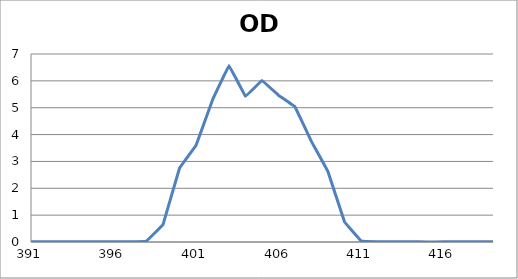
| Category | Series 0 |
|---|---|
| 2600.0 | 0.089 |
| 2599.0 | 0.09 |
| 2598.0 | 0.091 |
| 2597.0 | 0.091 |
| 2596.0 | 0.092 |
| 2595.0 | 0.093 |
| 2594.0 | 0.094 |
| 2593.0 | 0.095 |
| 2592.0 | 0.096 |
| 2591.0 | 0.096 |
| 2590.0 | 0.097 |
| 2589.0 | 0.098 |
| 2588.0 | 0.098 |
| 2587.0 | 0.099 |
| 2586.0 | 0.099 |
| 2585.0 | 0.1 |
| 2584.0 | 0.1 |
| 2583.0 | 0.1 |
| 2582.0 | 0.1 |
| 2581.0 | 0.1 |
| 2580.0 | 0.1 |
| 2579.0 | 0.1 |
| 2578.0 | 0.1 |
| 2577.0 | 0.1 |
| 2576.0 | 0.1 |
| 2575.0 | 0.099 |
| 2574.0 | 0.099 |
| 2573.0 | 0.099 |
| 2572.0 | 0.098 |
| 2571.0 | 0.098 |
| 2570.0 | 0.097 |
| 2569.0 | 0.096 |
| 2568.0 | 0.095 |
| 2567.0 | 0.095 |
| 2566.0 | 0.094 |
| 2565.0 | 0.093 |
| 2564.0 | 0.093 |
| 2563.0 | 0.092 |
| 2562.0 | 0.091 |
| 2561.0 | 0.09 |
| 2560.0 | 0.09 |
| 2559.0 | 0.089 |
| 2558.0 | 0.089 |
| 2557.0 | 0.088 |
| 2556.0 | 0.088 |
| 2555.0 | 0.087 |
| 2554.0 | 0.087 |
| 2553.0 | 0.087 |
| 2552.0 | 0.086 |
| 2551.0 | 0.086 |
| 2550.0 | 0.086 |
| 2549.0 | 0.085 |
| 2548.0 | 0.086 |
| 2547.0 | 0.086 |
| 2546.0 | 0.086 |
| 2545.0 | 0.086 |
| 2544.0 | 0.086 |
| 2543.0 | 0.087 |
| 2542.0 | 0.087 |
| 2541.0 | 0.088 |
| 2540.0 | 0.089 |
| 2539.0 | 0.089 |
| 2538.0 | 0.09 |
| 2537.0 | 0.09 |
| 2536.0 | 0.091 |
| 2535.0 | 0.092 |
| 2534.0 | 0.093 |
| 2533.0 | 0.094 |
| 2532.0 | 0.095 |
| 2531.0 | 0.096 |
| 2530.0 | 0.096 |
| 2529.0 | 0.097 |
| 2528.0 | 0.098 |
| 2527.0 | 0.098 |
| 2526.0 | 0.099 |
| 2525.0 | 0.1 |
| 2524.0 | 0.101 |
| 2523.0 | 0.101 |
| 2522.0 | 0.102 |
| 2521.0 | 0.102 |
| 2520.0 | 0.102 |
| 2519.0 | 0.103 |
| 2518.0 | 0.103 |
| 2517.0 | 0.103 |
| 2516.0 | 0.103 |
| 2515.0 | 0.103 |
| 2514.0 | 0.103 |
| 2513.0 | 0.102 |
| 2512.0 | 0.102 |
| 2511.0 | 0.101 |
| 2510.0 | 0.101 |
| 2509.0 | 0.1 |
| 2508.0 | 0.099 |
| 2507.0 | 0.098 |
| 2506.0 | 0.097 |
| 2505.0 | 0.096 |
| 2504.0 | 0.095 |
| 2503.0 | 0.093 |
| 2502.0 | 0.092 |
| 2501.0 | 0.091 |
| 2500.0 | 0.089 |
| 2499.0 | 0.088 |
| 2498.0 | 0.086 |
| 2497.0 | 0.085 |
| 2496.0 | 0.083 |
| 2495.0 | 0.082 |
| 2494.0 | 0.081 |
| 2493.0 | 0.08 |
| 2492.0 | 0.078 |
| 2491.0 | 0.077 |
| 2490.0 | 0.076 |
| 2489.0 | 0.075 |
| 2488.0 | 0.074 |
| 2487.0 | 0.074 |
| 2486.0 | 0.073 |
| 2485.0 | 0.073 |
| 2484.0 | 0.072 |
| 2483.0 | 0.072 |
| 2482.0 | 0.072 |
| 2481.0 | 0.073 |
| 2480.0 | 0.073 |
| 2479.0 | 0.074 |
| 2478.0 | 0.074 |
| 2477.0 | 0.075 |
| 2476.0 | 0.076 |
| 2475.0 | 0.078 |
| 2474.0 | 0.079 |
| 2473.0 | 0.081 |
| 2472.0 | 0.083 |
| 2471.0 | 0.085 |
| 2470.0 | 0.087 |
| 2469.0 | 0.089 |
| 2468.0 | 0.091 |
| 2467.0 | 0.094 |
| 2466.0 | 0.096 |
| 2465.0 | 0.099 |
| 2464.0 | 0.101 |
| 2463.0 | 0.104 |
| 2462.0 | 0.106 |
| 2461.0 | 0.109 |
| 2460.0 | 0.111 |
| 2459.0 | 0.114 |
| 2458.0 | 0.116 |
| 2457.0 | 0.118 |
| 2456.0 | 0.12 |
| 2455.0 | 0.122 |
| 2454.0 | 0.124 |
| 2453.0 | 0.125 |
| 2452.0 | 0.127 |
| 2451.0 | 0.128 |
| 2450.0 | 0.129 |
| 2449.0 | 0.13 |
| 2448.0 | 0.131 |
| 2447.0 | 0.131 |
| 2446.0 | 0.132 |
| 2445.0 | 0.132 |
| 2444.0 | 0.132 |
| 2443.0 | 0.131 |
| 2442.0 | 0.13 |
| 2441.0 | 0.13 |
| 2440.0 | 0.128 |
| 2439.0 | 0.127 |
| 2438.0 | 0.125 |
| 2437.0 | 0.123 |
| 2436.0 | 0.121 |
| 2435.0 | 0.119 |
| 2434.0 | 0.116 |
| 2433.0 | 0.114 |
| 2432.0 | 0.111 |
| 2431.0 | 0.108 |
| 2430.0 | 0.104 |
| 2429.0 | 0.101 |
| 2428.0 | 0.097 |
| 2427.0 | 0.094 |
| 2426.0 | 0.09 |
| 2425.0 | 0.086 |
| 2424.0 | 0.083 |
| 2423.0 | 0.079 |
| 2422.0 | 0.075 |
| 2421.0 | 0.072 |
| 2420.0 | 0.068 |
| 2419.0 | 0.065 |
| 2418.0 | 0.062 |
| 2417.0 | 0.058 |
| 2416.0 | 0.056 |
| 2415.0 | 0.053 |
| 2414.0 | 0.051 |
| 2413.0 | 0.049 |
| 2412.0 | 0.047 |
| 2411.0 | 0.045 |
| 2410.0 | 0.044 |
| 2409.0 | 0.043 |
| 2408.0 | 0.042 |
| 2407.0 | 0.041 |
| 2406.0 | 0.041 |
| 2405.0 | 0.041 |
| 2404.0 | 0.042 |
| 2403.0 | 0.043 |
| 2402.0 | 0.044 |
| 2401.0 | 0.045 |
| 2400.0 | 0.047 |
| 2399.0 | 0.049 |
| 2398.0 | 0.051 |
| 2397.0 | 0.053 |
| 2396.0 | 0.055 |
| 2395.0 | 0.058 |
| 2394.0 | 0.061 |
| 2393.0 | 0.063 |
| 2392.0 | 0.066 |
| 2391.0 | 0.069 |
| 2390.0 | 0.072 |
| 2389.0 | 0.075 |
| 2388.0 | 0.078 |
| 2387.0 | 0.081 |
| 2386.0 | 0.083 |
| 2385.0 | 0.086 |
| 2384.0 | 0.088 |
| 2383.0 | 0.09 |
| 2382.0 | 0.092 |
| 2381.0 | 0.094 |
| 2380.0 | 0.095 |
| 2379.0 | 0.097 |
| 2378.0 | 0.097 |
| 2377.0 | 0.098 |
| 2376.0 | 0.099 |
| 2375.0 | 0.099 |
| 2374.0 | 0.099 |
| 2373.0 | 0.098 |
| 2372.0 | 0.098 |
| 2371.0 | 0.097 |
| 2370.0 | 0.096 |
| 2369.0 | 0.094 |
| 2368.0 | 0.093 |
| 2367.0 | 0.091 |
| 2366.0 | 0.089 |
| 2365.0 | 0.087 |
| 2364.0 | 0.084 |
| 2363.0 | 0.081 |
| 2362.0 | 0.079 |
| 2361.0 | 0.076 |
| 2360.0 | 0.072 |
| 2359.0 | 0.069 |
| 2358.0 | 0.066 |
| 2357.0 | 0.063 |
| 2356.0 | 0.059 |
| 2355.0 | 0.056 |
| 2354.0 | 0.053 |
| 2353.0 | 0.05 |
| 2352.0 | 0.046 |
| 2351.0 | 0.043 |
| 2350.0 | 0.041 |
| 2349.0 | 0.038 |
| 2348.0 | 0.036 |
| 2347.0 | 0.034 |
| 2346.0 | 0.033 |
| 2345.0 | 0.031 |
| 2344.0 | 0.03 |
| 2343.0 | 0.029 |
| 2342.0 | 0.029 |
| 2341.0 | 0.029 |
| 2340.0 | 0.029 |
| 2339.0 | 0.03 |
| 2338.0 | 0.031 |
| 2337.0 | 0.032 |
| 2336.0 | 0.034 |
| 2335.0 | 0.035 |
| 2334.0 | 0.037 |
| 2333.0 | 0.04 |
| 2332.0 | 0.042 |
| 2331.0 | 0.045 |
| 2330.0 | 0.047 |
| 2329.0 | 0.05 |
| 2328.0 | 0.053 |
| 2327.0 | 0.056 |
| 2326.0 | 0.059 |
| 2325.0 | 0.062 |
| 2324.0 | 0.065 |
| 2323.0 | 0.068 |
| 2322.0 | 0.071 |
| 2321.0 | 0.074 |
| 2320.0 | 0.076 |
| 2319.0 | 0.079 |
| 2318.0 | 0.081 |
| 2317.0 | 0.083 |
| 2316.0 | 0.085 |
| 2315.0 | 0.086 |
| 2314.0 | 0.088 |
| 2313.0 | 0.089 |
| 2312.0 | 0.09 |
| 2311.0 | 0.09 |
| 2310.0 | 0.09 |
| 2309.0 | 0.09 |
| 2308.0 | 0.09 |
| 2307.0 | 0.089 |
| 2306.0 | 0.088 |
| 2305.0 | 0.087 |
| 2304.0 | 0.085 |
| 2303.0 | 0.083 |
| 2302.0 | 0.081 |
| 2301.0 | 0.079 |
| 2300.0 | 0.077 |
| 2299.0 | 0.074 |
| 2298.0 | 0.071 |
| 2297.0 | 0.068 |
| 2296.0 | 0.065 |
| 2295.0 | 0.063 |
| 2294.0 | 0.06 |
| 2293.0 | 0.057 |
| 2292.0 | 0.054 |
| 2291.0 | 0.051 |
| 2290.0 | 0.048 |
| 2289.0 | 0.045 |
| 2288.0 | 0.043 |
| 2287.0 | 0.04 |
| 2286.0 | 0.038 |
| 2285.0 | 0.036 |
| 2284.0 | 0.034 |
| 2283.0 | 0.032 |
| 2282.0 | 0.031 |
| 2281.0 | 0.03 |
| 2280.0 | 0.029 |
| 2279.0 | 0.029 |
| 2278.0 | 0.028 |
| 2277.0 | 0.029 |
| 2276.0 | 0.029 |
| 2275.0 | 0.03 |
| 2274.0 | 0.031 |
| 2273.0 | 0.032 |
| 2272.0 | 0.033 |
| 2271.0 | 0.035 |
| 2270.0 | 0.037 |
| 2269.0 | 0.039 |
| 2268.0 | 0.041 |
| 2267.0 | 0.044 |
| 2266.0 | 0.046 |
| 2265.0 | 0.048 |
| 2264.0 | 0.05 |
| 2263.0 | 0.053 |
| 2262.0 | 0.055 |
| 2261.0 | 0.057 |
| 2260.0 | 0.059 |
| 2259.0 | 0.061 |
| 2258.0 | 0.063 |
| 2257.0 | 0.064 |
| 2256.0 | 0.066 |
| 2255.0 | 0.067 |
| 2254.0 | 0.068 |
| 2253.0 | 0.069 |
| 2252.0 | 0.069 |
| 2251.0 | 0.07 |
| 2250.0 | 0.07 |
| 2249.0 | 0.07 |
| 2248.0 | 0.069 |
| 2247.0 | 0.069 |
| 2246.0 | 0.068 |
| 2245.0 | 0.067 |
| 2244.0 | 0.066 |
| 2243.0 | 0.064 |
| 2242.0 | 0.062 |
| 2241.0 | 0.061 |
| 2240.0 | 0.059 |
| 2239.0 | 0.057 |
| 2238.0 | 0.055 |
| 2237.0 | 0.053 |
| 2236.0 | 0.051 |
| 2235.0 | 0.048 |
| 2234.0 | 0.046 |
| 2233.0 | 0.044 |
| 2232.0 | 0.042 |
| 2231.0 | 0.04 |
| 2230.0 | 0.039 |
| 2229.0 | 0.037 |
| 2228.0 | 0.036 |
| 2227.0 | 0.035 |
| 2226.0 | 0.034 |
| 2225.0 | 0.033 |
| 2224.0 | 0.033 |
| 2223.0 | 0.032 |
| 2222.0 | 0.032 |
| 2221.0 | 0.033 |
| 2220.0 | 0.033 |
| 2219.0 | 0.034 |
| 2218.0 | 0.035 |
| 2217.0 | 0.036 |
| 2216.0 | 0.038 |
| 2215.0 | 0.039 |
| 2214.0 | 0.041 |
| 2213.0 | 0.043 |
| 2212.0 | 0.044 |
| 2211.0 | 0.046 |
| 2210.0 | 0.048 |
| 2209.0 | 0.05 |
| 2208.0 | 0.052 |
| 2207.0 | 0.054 |
| 2206.0 | 0.056 |
| 2205.0 | 0.058 |
| 2204.0 | 0.059 |
| 2203.0 | 0.061 |
| 2202.0 | 0.062 |
| 2201.0 | 0.063 |
| 2200.0 | 0.064 |
| 2199.0 | 0.065 |
| 2198.0 | 0.066 |
| 2197.0 | 0.066 |
| 2196.0 | 0.066 |
| 2195.0 | 0.066 |
| 2194.0 | 0.066 |
| 2193.0 | 0.065 |
| 2192.0 | 0.064 |
| 2191.0 | 0.064 |
| 2190.0 | 0.062 |
| 2189.0 | 0.061 |
| 2188.0 | 0.059 |
| 2187.0 | 0.058 |
| 2186.0 | 0.056 |
| 2185.0 | 0.054 |
| 2184.0 | 0.052 |
| 2183.0 | 0.05 |
| 2182.0 | 0.048 |
| 2181.0 | 0.045 |
| 2180.0 | 0.043 |
| 2179.0 | 0.041 |
| 2178.0 | 0.039 |
| 2177.0 | 0.037 |
| 2176.0 | 0.036 |
| 2175.0 | 0.034 |
| 2174.0 | 0.032 |
| 2173.0 | 0.031 |
| 2172.0 | 0.03 |
| 2171.0 | 0.029 |
| 2170.0 | 0.028 |
| 2169.0 | 0.028 |
| 2168.0 | 0.027 |
| 2167.0 | 0.027 |
| 2166.0 | 0.027 |
| 2165.0 | 0.027 |
| 2164.0 | 0.028 |
| 2163.0 | 0.028 |
| 2162.0 | 0.029 |
| 2161.0 | 0.03 |
| 2160.0 | 0.031 |
| 2159.0 | 0.033 |
| 2158.0 | 0.034 |
| 2157.0 | 0.035 |
| 2156.0 | 0.037 |
| 2155.0 | 0.038 |
| 2154.0 | 0.039 |
| 2153.0 | 0.041 |
| 2152.0 | 0.042 |
| 2151.0 | 0.043 |
| 2150.0 | 0.044 |
| 2149.0 | 0.045 |
| 2148.0 | 0.046 |
| 2147.0 | 0.047 |
| 2146.0 | 0.047 |
| 2145.0 | 0.047 |
| 2144.0 | 0.047 |
| 2143.0 | 0.047 |
| 2142.0 | 0.047 |
| 2141.0 | 0.047 |
| 2140.0 | 0.046 |
| 2139.0 | 0.045 |
| 2138.0 | 0.045 |
| 2137.0 | 0.043 |
| 2136.0 | 0.042 |
| 2135.0 | 0.041 |
| 2134.0 | 0.04 |
| 2133.0 | 0.039 |
| 2132.0 | 0.037 |
| 2131.0 | 0.036 |
| 2130.0 | 0.034 |
| 2129.0 | 0.033 |
| 2128.0 | 0.032 |
| 2127.0 | 0.031 |
| 2126.0 | 0.03 |
| 2125.0 | 0.029 |
| 2124.0 | 0.028 |
| 2123.0 | 0.027 |
| 2122.0 | 0.027 |
| 2121.0 | 0.026 |
| 2120.0 | 0.026 |
| 2119.0 | 0.026 |
| 2118.0 | 0.027 |
| 2117.0 | 0.027 |
| 2116.0 | 0.028 |
| 2115.0 | 0.029 |
| 2114.0 | 0.03 |
| 2113.0 | 0.031 |
| 2112.0 | 0.032 |
| 2111.0 | 0.033 |
| 2110.0 | 0.035 |
| 2109.0 | 0.036 |
| 2108.0 | 0.038 |
| 2107.0 | 0.04 |
| 2106.0 | 0.041 |
| 2105.0 | 0.042 |
| 2104.0 | 0.044 |
| 2103.0 | 0.045 |
| 2102.0 | 0.046 |
| 2101.0 | 0.047 |
| 2100.0 | 0.048 |
| 2099.0 | 0.049 |
| 2098.0 | 0.049 |
| 2097.0 | 0.05 |
| 2096.0 | 0.05 |
| 2095.0 | 0.05 |
| 2094.0 | 0.049 |
| 2093.0 | 0.049 |
| 2092.0 | 0.048 |
| 2091.0 | 0.047 |
| 2090.0 | 0.047 |
| 2089.0 | 0.046 |
| 2088.0 | 0.045 |
| 2087.0 | 0.043 |
| 2086.0 | 0.042 |
| 2085.0 | 0.041 |
| 2084.0 | 0.039 |
| 2083.0 | 0.038 |
| 2082.0 | 0.037 |
| 2081.0 | 0.036 |
| 2080.0 | 0.035 |
| 2079.0 | 0.034 |
| 2078.0 | 0.033 |
| 2077.0 | 0.033 |
| 2076.0 | 0.033 |
| 2075.0 | 0.033 |
| 2074.0 | 0.033 |
| 2073.0 | 0.034 |
| 2072.0 | 0.034 |
| 2071.0 | 0.036 |
| 2070.0 | 0.037 |
| 2069.0 | 0.039 |
| 2068.0 | 0.041 |
| 2067.0 | 0.043 |
| 2066.0 | 0.045 |
| 2065.0 | 0.047 |
| 2064.0 | 0.05 |
| 2063.0 | 0.052 |
| 2062.0 | 0.055 |
| 2061.0 | 0.057 |
| 2060.0 | 0.06 |
| 2059.0 | 0.062 |
| 2058.0 | 0.065 |
| 2057.0 | 0.067 |
| 2056.0 | 0.069 |
| 2055.0 | 0.071 |
| 2054.0 | 0.072 |
| 2053.0 | 0.073 |
| 2052.0 | 0.074 |
| 2051.0 | 0.075 |
| 2050.0 | 0.075 |
| 2049.0 | 0.076 |
| 2048.0 | 0.075 |
| 2047.0 | 0.075 |
| 2046.0 | 0.074 |
| 2045.0 | 0.073 |
| 2044.0 | 0.071 |
| 2043.0 | 0.07 |
| 2042.0 | 0.068 |
| 2041.0 | 0.065 |
| 2040.0 | 0.063 |
| 2039.0 | 0.061 |
| 2038.0 | 0.058 |
| 2037.0 | 0.055 |
| 2036.0 | 0.053 |
| 2035.0 | 0.05 |
| 2034.0 | 0.047 |
| 2033.0 | 0.045 |
| 2032.0 | 0.043 |
| 2031.0 | 0.041 |
| 2030.0 | 0.039 |
| 2029.0 | 0.037 |
| 2028.0 | 0.036 |
| 2027.0 | 0.036 |
| 2026.0 | 0.035 |
| 2025.0 | 0.036 |
| 2024.0 | 0.036 |
| 2023.0 | 0.037 |
| 2022.0 | 0.039 |
| 2021.0 | 0.041 |
| 2020.0 | 0.043 |
| 2019.0 | 0.046 |
| 2018.0 | 0.049 |
| 2017.0 | 0.052 |
| 2016.0 | 0.055 |
| 2015.0 | 0.058 |
| 2014.0 | 0.062 |
| 2013.0 | 0.065 |
| 2012.0 | 0.069 |
| 2011.0 | 0.072 |
| 2010.0 | 0.075 |
| 2009.0 | 0.078 |
| 2008.0 | 0.081 |
| 2007.0 | 0.084 |
| 2006.0 | 0.086 |
| 2005.0 | 0.088 |
| 2004.0 | 0.09 |
| 2003.0 | 0.091 |
| 2002.0 | 0.092 |
| 2001.0 | 0.093 |
| 2000.0 | 0.093 |
| 1999.0 | 0.092 |
| 1998.0 | 0.092 |
| 1997.0 | 0.09 |
| 1996.0 | 0.089 |
| 1995.0 | 0.087 |
| 1994.0 | 0.085 |
| 1993.0 | 0.082 |
| 1992.0 | 0.079 |
| 1991.0 | 0.076 |
| 1990.0 | 0.073 |
| 1989.0 | 0.07 |
| 1988.0 | 0.066 |
| 1987.0 | 0.063 |
| 1986.0 | 0.06 |
| 1985.0 | 0.057 |
| 1984.0 | 0.054 |
| 1983.0 | 0.052 |
| 1982.0 | 0.05 |
| 1981.0 | 0.048 |
| 1980.0 | 0.046 |
| 1979.0 | 0.045 |
| 1978.0 | 0.045 |
| 1977.0 | 0.044 |
| 1976.0 | 0.045 |
| 1975.0 | 0.045 |
| 1974.0 | 0.046 |
| 1973.0 | 0.047 |
| 1972.0 | 0.049 |
| 1971.0 | 0.051 |
| 1970.0 | 0.053 |
| 1969.0 | 0.056 |
| 1968.0 | 0.058 |
| 1967.0 | 0.061 |
| 1966.0 | 0.063 |
| 1965.0 | 0.066 |
| 1964.0 | 0.068 |
| 1963.0 | 0.071 |
| 1962.0 | 0.073 |
| 1961.0 | 0.075 |
| 1960.0 | 0.076 |
| 1959.0 | 0.077 |
| 1958.0 | 0.078 |
| 1957.0 | 0.079 |
| 1956.0 | 0.079 |
| 1955.0 | 0.079 |
| 1954.0 | 0.078 |
| 1953.0 | 0.077 |
| 1952.0 | 0.076 |
| 1951.0 | 0.074 |
| 1950.0 | 0.072 |
| 1949.0 | 0.069 |
| 1948.0 | 0.067 |
| 1947.0 | 0.064 |
| 1946.0 | 0.061 |
| 1945.0 | 0.058 |
| 1944.0 | 0.054 |
| 1943.0 | 0.051 |
| 1942.0 | 0.048 |
| 1941.0 | 0.046 |
| 1940.0 | 0.043 |
| 1939.0 | 0.04 |
| 1938.0 | 0.039 |
| 1937.0 | 0.037 |
| 1936.0 | 0.036 |
| 1935.0 | 0.035 |
| 1934.0 | 0.034 |
| 1933.0 | 0.034 |
| 1932.0 | 0.035 |
| 1931.0 | 0.036 |
| 1930.0 | 0.037 |
| 1929.0 | 0.038 |
| 1928.0 | 0.04 |
| 1927.0 | 0.043 |
| 1926.0 | 0.045 |
| 1925.0 | 0.048 |
| 1924.0 | 0.05 |
| 1923.0 | 0.053 |
| 1922.0 | 0.056 |
| 1921.0 | 0.058 |
| 1920.0 | 0.061 |
| 1919.0 | 0.064 |
| 1918.0 | 0.066 |
| 1917.0 | 0.068 |
| 1916.0 | 0.069 |
| 1915.0 | 0.07 |
| 1914.0 | 0.071 |
| 1913.0 | 0.071 |
| 1912.0 | 0.072 |
| 1911.0 | 0.071 |
| 1910.0 | 0.071 |
| 1909.0 | 0.07 |
| 1908.0 | 0.068 |
| 1907.0 | 0.066 |
| 1906.0 | 0.064 |
| 1905.0 | 0.061 |
| 1904.0 | 0.058 |
| 1903.0 | 0.056 |
| 1902.0 | 0.053 |
| 1901.0 | 0.05 |
| 1900.0 | 0.047 |
| 1899.0 | 0.043 |
| 1898.0 | 0.04 |
| 1897.0 | 0.038 |
| 1896.0 | 0.035 |
| 1895.0 | 0.033 |
| 1894.0 | 0.031 |
| 1893.0 | 0.029 |
| 1892.0 | 0.027 |
| 1891.0 | 0.026 |
| 1890.0 | 0.025 |
| 1889.0 | 0.025 |
| 1888.0 | 0.024 |
| 1887.0 | 0.024 |
| 1886.0 | 0.025 |
| 1885.0 | 0.025 |
| 1884.0 | 0.026 |
| 1883.0 | 0.027 |
| 1882.0 | 0.028 |
| 1881.0 | 0.029 |
| 1880.0 | 0.03 |
| 1879.0 | 0.031 |
| 1878.0 | 0.032 |
| 1877.0 | 0.034 |
| 1876.0 | 0.035 |
| 1875.0 | 0.035 |
| 1874.0 | 0.036 |
| 1873.0 | 0.037 |
| 1872.0 | 0.037 |
| 1871.0 | 0.038 |
| 1870.0 | 0.038 |
| 1869.0 | 0.038 |
| 1868.0 | 0.038 |
| 1867.0 | 0.037 |
| 1866.0 | 0.037 |
| 1865.0 | 0.036 |
| 1864.0 | 0.035 |
| 1863.0 | 0.034 |
| 1862.0 | 0.033 |
| 1861.0 | 0.033 |
| 1860.0 | 0.032 |
| 1859.0 | 0.031 |
| 1858.0 | 0.031 |
| 1857.0 | 0.03 |
| 1856.0 | 0.029 |
| 1855.0 | 0.029 |
| 1854.0 | 0.029 |
| 1853.0 | 0.029 |
| 1852.0 | 0.029 |
| 1851.0 | 0.029 |
| 1850.0 | 0.029 |
| 1849.0 | 0.029 |
| 1848.0 | 0.029 |
| 1847.0 | 0.029 |
| 1846.0 | 0.03 |
| 1845.0 | 0.03 |
| 1844.0 | 0.03 |
| 1843.0 | 0.03 |
| 1842.0 | 0.03 |
| 1841.0 | 0.03 |
| 1840.0 | 0.03 |
| 1839.0 | 0.03 |
| 1838.0 | 0.03 |
| 1837.0 | 0.03 |
| 1836.0 | 0.029 |
| 1835.0 | 0.029 |
| 1834.0 | 0.029 |
| 1833.0 | 0.028 |
| 1832.0 | 0.028 |
| 1831.0 | 0.028 |
| 1830.0 | 0.028 |
| 1829.0 | 0.028 |
| 1828.0 | 0.028 |
| 1827.0 | 0.028 |
| 1826.0 | 0.029 |
| 1825.0 | 0.03 |
| 1824.0 | 0.031 |
| 1823.0 | 0.032 |
| 1822.0 | 0.033 |
| 1821.0 | 0.035 |
| 1820.0 | 0.037 |
| 1819.0 | 0.04 |
| 1818.0 | 0.042 |
| 1817.0 | 0.045 |
| 1816.0 | 0.047 |
| 1815.0 | 0.049 |
| 1814.0 | 0.052 |
| 1813.0 | 0.054 |
| 1812.0 | 0.056 |
| 1811.0 | 0.058 |
| 1810.0 | 0.06 |
| 1809.0 | 0.062 |
| 1808.0 | 0.063 |
| 1807.0 | 0.064 |
| 1806.0 | 0.064 |
| 1805.0 | 0.064 |
| 1804.0 | 0.064 |
| 1803.0 | 0.063 |
| 1802.0 | 0.062 |
| 1801.0 | 0.061 |
| 1800.0 | 0.059 |
| 1799.0 | 0.057 |
| 1798.0 | 0.055 |
| 1797.0 | 0.052 |
| 1796.0 | 0.05 |
| 1795.0 | 0.048 |
| 1794.0 | 0.046 |
| 1793.0 | 0.044 |
| 1792.0 | 0.042 |
| 1791.0 | 0.041 |
| 1790.0 | 0.04 |
| 1789.0 | 0.04 |
| 1788.0 | 0.04 |
| 1787.0 | 0.041 |
| 1786.0 | 0.043 |
| 1785.0 | 0.046 |
| 1784.0 | 0.049 |
| 1783.0 | 0.053 |
| 1782.0 | 0.057 |
| 1781.0 | 0.062 |
| 1780.0 | 0.067 |
| 1779.0 | 0.072 |
| 1778.0 | 0.078 |
| 1777.0 | 0.083 |
| 1776.0 | 0.089 |
| 1775.0 | 0.094 |
| 1774.0 | 0.098 |
| 1773.0 | 0.103 |
| 1772.0 | 0.107 |
| 1771.0 | 0.11 |
| 1770.0 | 0.113 |
| 1769.0 | 0.115 |
| 1768.0 | 0.116 |
| 1767.0 | 0.117 |
| 1766.0 | 0.117 |
| 1765.0 | 0.116 |
| 1764.0 | 0.115 |
| 1763.0 | 0.113 |
| 1762.0 | 0.11 |
| 1761.0 | 0.107 |
| 1760.0 | 0.103 |
| 1759.0 | 0.099 |
| 1758.0 | 0.094 |
| 1757.0 | 0.09 |
| 1756.0 | 0.085 |
| 1755.0 | 0.081 |
| 1754.0 | 0.077 |
| 1753.0 | 0.073 |
| 1752.0 | 0.07 |
| 1751.0 | 0.068 |
| 1750.0 | 0.066 |
| 1749.0 | 0.065 |
| 1748.0 | 0.065 |
| 1747.0 | 0.066 |
| 1746.0 | 0.068 |
| 1745.0 | 0.07 |
| 1744.0 | 0.073 |
| 1743.0 | 0.076 |
| 1742.0 | 0.08 |
| 1741.0 | 0.084 |
| 1740.0 | 0.088 |
| 1739.0 | 0.092 |
| 1738.0 | 0.096 |
| 1737.0 | 0.099 |
| 1736.0 | 0.102 |
| 1735.0 | 0.105 |
| 1734.0 | 0.107 |
| 1733.0 | 0.109 |
| 1732.0 | 0.11 |
| 1731.0 | 0.111 |
| 1730.0 | 0.111 |
| 1729.0 | 0.11 |
| 1728.0 | 0.108 |
| 1727.0 | 0.106 |
| 1726.0 | 0.104 |
| 1725.0 | 0.101 |
| 1724.0 | 0.098 |
| 1723.0 | 0.095 |
| 1722.0 | 0.092 |
| 1721.0 | 0.088 |
| 1720.0 | 0.085 |
| 1719.0 | 0.083 |
| 1718.0 | 0.081 |
| 1717.0 | 0.079 |
| 1716.0 | 0.078 |
| 1715.0 | 0.077 |
| 1714.0 | 0.077 |
| 1713.0 | 0.079 |
| 1712.0 | 0.08 |
| 1711.0 | 0.083 |
| 1710.0 | 0.086 |
| 1709.0 | 0.089 |
| 1708.0 | 0.092 |
| 1707.0 | 0.096 |
| 1706.0 | 0.1 |
| 1705.0 | 0.103 |
| 1704.0 | 0.107 |
| 1703.0 | 0.11 |
| 1702.0 | 0.113 |
| 1701.0 | 0.115 |
| 1700.0 | 0.117 |
| 1699.0 | 0.118 |
| 1698.0 | 0.118 |
| 1697.0 | 0.118 |
| 1696.0 | 0.118 |
| 1695.0 | 0.116 |
| 1694.0 | 0.115 |
| 1693.0 | 0.113 |
| 1692.0 | 0.111 |
| 1691.0 | 0.109 |
| 1690.0 | 0.107 |
| 1689.0 | 0.105 |
| 1688.0 | 0.103 |
| 1687.0 | 0.102 |
| 1686.0 | 0.101 |
| 1685.0 | 0.101 |
| 1684.0 | 0.101 |
| 1683.0 | 0.102 |
| 1682.0 | 0.104 |
| 1681.0 | 0.106 |
| 1680.0 | 0.109 |
| 1679.0 | 0.112 |
| 1678.0 | 0.116 |
| 1677.0 | 0.12 |
| 1676.0 | 0.125 |
| 1675.0 | 0.129 |
| 1674.0 | 0.133 |
| 1673.0 | 0.137 |
| 1672.0 | 0.14 |
| 1671.0 | 0.143 |
| 1670.0 | 0.145 |
| 1669.0 | 0.146 |
| 1668.0 | 0.147 |
| 1667.0 | 0.146 |
| 1666.0 | 0.145 |
| 1665.0 | 0.144 |
| 1664.0 | 0.141 |
| 1663.0 | 0.138 |
| 1662.0 | 0.135 |
| 1661.0 | 0.132 |
| 1660.0 | 0.128 |
| 1659.0 | 0.125 |
| 1658.0 | 0.122 |
| 1657.0 | 0.119 |
| 1656.0 | 0.117 |
| 1655.0 | 0.116 |
| 1654.0 | 0.116 |
| 1653.0 | 0.117 |
| 1652.0 | 0.119 |
| 1651.0 | 0.122 |
| 1650.0 | 0.125 |
| 1649.0 | 0.13 |
| 1648.0 | 0.135 |
| 1647.0 | 0.142 |
| 1646.0 | 0.148 |
| 1645.0 | 0.155 |
| 1644.0 | 0.162 |
| 1643.0 | 0.168 |
| 1642.0 | 0.175 |
| 1641.0 | 0.181 |
| 1640.0 | 0.186 |
| 1639.0 | 0.19 |
| 1638.0 | 0.193 |
| 1637.0 | 0.195 |
| 1636.0 | 0.195 |
| 1635.0 | 0.195 |
| 1634.0 | 0.194 |
| 1633.0 | 0.191 |
| 1632.0 | 0.187 |
| 1631.0 | 0.183 |
| 1630.0 | 0.178 |
| 1629.0 | 0.173 |
| 1628.0 | 0.167 |
| 1627.0 | 0.161 |
| 1626.0 | 0.156 |
| 1625.0 | 0.151 |
| 1624.0 | 0.146 |
| 1623.0 | 0.143 |
| 1622.0 | 0.141 |
| 1621.0 | 0.14 |
| 1620.0 | 0.14 |
| 1619.0 | 0.141 |
| 1618.0 | 0.143 |
| 1617.0 | 0.146 |
| 1616.0 | 0.149 |
| 1615.0 | 0.153 |
| 1614.0 | 0.157 |
| 1613.0 | 0.161 |
| 1612.0 | 0.165 |
| 1611.0 | 0.169 |
| 1610.0 | 0.172 |
| 1609.0 | 0.174 |
| 1608.0 | 0.175 |
| 1607.0 | 0.176 |
| 1606.0 | 0.175 |
| 1605.0 | 0.173 |
| 1604.0 | 0.17 |
| 1603.0 | 0.166 |
| 1602.0 | 0.162 |
| 1601.0 | 0.156 |
| 1600.0 | 0.15 |
| 1599.0 | 0.144 |
| 1598.0 | 0.139 |
| 1597.0 | 0.133 |
| 1596.0 | 0.129 |
| 1595.0 | 0.126 |
| 1594.0 | 0.124 |
| 1593.0 | 0.124 |
| 1592.0 | 0.125 |
| 1591.0 | 0.128 |
| 1590.0 | 0.133 |
| 1589.0 | 0.139 |
| 1588.0 | 0.147 |
| 1587.0 | 0.155 |
| 1586.0 | 0.164 |
| 1585.0 | 0.173 |
| 1584.0 | 0.182 |
| 1583.0 | 0.19 |
| 1582.0 | 0.197 |
| 1581.0 | 0.203 |
| 1580.0 | 0.208 |
| 1579.0 | 0.212 |
| 1578.0 | 0.214 |
| 1577.0 | 0.214 |
| 1576.0 | 0.213 |
| 1575.0 | 0.21 |
| 1574.0 | 0.206 |
| 1573.0 | 0.201 |
| 1572.0 | 0.194 |
| 1571.0 | 0.186 |
| 1570.0 | 0.178 |
| 1569.0 | 0.17 |
| 1568.0 | 0.161 |
| 1567.0 | 0.154 |
| 1566.0 | 0.147 |
| 1565.0 | 0.14 |
| 1564.0 | 0.136 |
| 1563.0 | 0.133 |
| 1562.0 | 0.132 |
| 1561.0 | 0.133 |
| 1560.0 | 0.136 |
| 1559.0 | 0.14 |
| 1558.0 | 0.146 |
| 1557.0 | 0.153 |
| 1556.0 | 0.16 |
| 1555.0 | 0.167 |
| 1554.0 | 0.175 |
| 1553.0 | 0.181 |
| 1552.0 | 0.187 |
| 1551.0 | 0.192 |
| 1550.0 | 0.195 |
| 1549.0 | 0.196 |
| 1548.0 | 0.197 |
| 1547.0 | 0.195 |
| 1546.0 | 0.193 |
| 1545.0 | 0.188 |
| 1544.0 | 0.183 |
| 1543.0 | 0.177 |
| 1542.0 | 0.171 |
| 1541.0 | 0.164 |
| 1540.0 | 0.158 |
| 1539.0 | 0.153 |
| 1538.0 | 0.148 |
| 1537.0 | 0.145 |
| 1536.0 | 0.143 |
| 1535.0 | 0.142 |
| 1534.0 | 0.143 |
| 1533.0 | 0.146 |
| 1532.0 | 0.149 |
| 1531.0 | 0.154 |
| 1530.0 | 0.159 |
| 1529.0 | 0.165 |
| 1528.0 | 0.17 |
| 1527.0 | 0.176 |
| 1526.0 | 0.18 |
| 1525.0 | 0.184 |
| 1524.0 | 0.187 |
| 1523.0 | 0.188 |
| 1522.0 | 0.188 |
| 1521.0 | 0.186 |
| 1520.0 | 0.183 |
| 1519.0 | 0.178 |
| 1518.0 | 0.173 |
| 1517.0 | 0.168 |
| 1516.0 | 0.161 |
| 1515.0 | 0.155 |
| 1514.0 | 0.15 |
| 1513.0 | 0.146 |
| 1512.0 | 0.144 |
| 1511.0 | 0.144 |
| 1510.0 | 0.146 |
| 1509.0 | 0.15 |
| 1508.0 | 0.157 |
| 1507.0 | 0.165 |
| 1506.0 | 0.176 |
| 1505.0 | 0.186 |
| 1504.0 | 0.198 |
| 1503.0 | 0.21 |
| 1502.0 | 0.221 |
| 1501.0 | 0.233 |
| 1500.0 | 0.242 |
| 1499.0 | 0.25 |
| 1498.0 | 0.256 |
| 1497.0 | 0.261 |
| 1496.0 | 0.263 |
| 1495.0 | 0.264 |
| 1494.0 | 0.263 |
| 1493.0 | 0.26 |
| 1492.0 | 0.256 |
| 1491.0 | 0.25 |
| 1490.0 | 0.244 |
| 1489.0 | 0.237 |
| 1488.0 | 0.231 |
| 1487.0 | 0.225 |
| 1486.0 | 0.22 |
| 1485.0 | 0.216 |
| 1484.0 | 0.215 |
| 1483.0 | 0.215 |
| 1482.0 | 0.218 |
| 1481.0 | 0.222 |
| 1480.0 | 0.229 |
| 1479.0 | 0.237 |
| 1478.0 | 0.245 |
| 1477.0 | 0.254 |
| 1476.0 | 0.263 |
| 1475.0 | 0.272 |
| 1474.0 | 0.278 |
| 1473.0 | 0.283 |
| 1472.0 | 0.286 |
| 1471.0 | 0.287 |
| 1470.0 | 0.286 |
| 1469.0 | 0.282 |
| 1468.0 | 0.277 |
| 1467.0 | 0.269 |
| 1466.0 | 0.259 |
| 1465.0 | 0.248 |
| 1464.0 | 0.235 |
| 1463.0 | 0.223 |
| 1462.0 | 0.21 |
| 1461.0 | 0.198 |
| 1460.0 | 0.189 |
| 1459.0 | 0.181 |
| 1458.0 | 0.176 |
| 1457.0 | 0.174 |
| 1456.0 | 0.174 |
| 1455.0 | 0.178 |
| 1454.0 | 0.184 |
| 1453.0 | 0.192 |
| 1452.0 | 0.202 |
| 1451.0 | 0.213 |
| 1450.0 | 0.224 |
| 1449.0 | 0.235 |
| 1448.0 | 0.245 |
| 1447.0 | 0.254 |
| 1446.0 | 0.261 |
| 1445.0 | 0.266 |
| 1444.0 | 0.27 |
| 1443.0 | 0.272 |
| 1442.0 | 0.271 |
| 1441.0 | 0.268 |
| 1440.0 | 0.263 |
| 1439.0 | 0.256 |
| 1438.0 | 0.248 |
| 1437.0 | 0.239 |
| 1436.0 | 0.23 |
| 1435.0 | 0.22 |
| 1434.0 | 0.21 |
| 1433.0 | 0.2 |
| 1432.0 | 0.191 |
| 1431.0 | 0.183 |
| 1430.0 | 0.175 |
| 1429.0 | 0.169 |
| 1428.0 | 0.164 |
| 1427.0 | 0.16 |
| 1426.0 | 0.156 |
| 1425.0 | 0.152 |
| 1424.0 | 0.15 |
| 1423.0 | 0.148 |
| 1422.0 | 0.146 |
| 1421.0 | 0.144 |
| 1420.0 | 0.143 |
| 1419.0 | 0.142 |
| 1418.0 | 0.142 |
| 1417.0 | 0.142 |
| 1416.0 | 0.144 |
| 1415.0 | 0.146 |
| 1414.0 | 0.149 |
| 1413.0 | 0.155 |
| 1412.0 | 0.161 |
| 1411.0 | 0.168 |
| 1410.0 | 0.175 |
| 1409.0 | 0.182 |
| 1408.0 | 0.19 |
| 1407.0 | 0.199 |
| 1406.0 | 0.207 |
| 1405.0 | 0.213 |
| 1404.0 | 0.218 |
| 1403.0 | 0.222 |
| 1402.0 | 0.225 |
| 1401.0 | 0.225 |
| 1400.0 | 0.223 |
| 1399.0 | 0.22 |
| 1398.0 | 0.217 |
| 1397.0 | 0.212 |
| 1396.0 | 0.204 |
| 1395.0 | 0.197 |
| 1394.0 | 0.188 |
| 1393.0 | 0.182 |
| 1392.0 | 0.176 |
| 1391.0 | 0.169 |
| 1390.0 | 0.165 |
| 1389.0 | 0.161 |
| 1388.0 | 0.159 |
| 1387.0 | 0.159 |
| 1386.0 | 0.16 |
| 1385.0 | 0.162 |
| 1384.0 | 0.165 |
| 1383.0 | 0.167 |
| 1382.0 | 0.17 |
| 1381.0 | 0.174 |
| 1380.0 | 0.176 |
| 1379.0 | 0.177 |
| 1378.0 | 0.177 |
| 1377.0 | 0.177 |
| 1376.0 | 0.177 |
| 1375.0 | 0.176 |
| 1374.0 | 0.176 |
| 1373.0 | 0.176 |
| 1372.0 | 0.177 |
| 1371.0 | 0.178 |
| 1370.0 | 0.18 |
| 1369.0 | 0.183 |
| 1368.0 | 0.186 |
| 1367.0 | 0.189 |
| 1366.0 | 0.193 |
| 1365.0 | 0.195 |
| 1364.0 | 0.198 |
| 1363.0 | 0.2 |
| 1362.0 | 0.201 |
| 1361.0 | 0.2 |
| 1360.0 | 0.199 |
| 1359.0 | 0.197 |
| 1358.0 | 0.192 |
| 1357.0 | 0.187 |
| 1356.0 | 0.181 |
| 1355.0 | 0.175 |
| 1354.0 | 0.171 |
| 1353.0 | 0.168 |
| 1352.0 | 0.167 |
| 1351.0 | 0.168 |
| 1350.0 | 0.171 |
| 1349.0 | 0.176 |
| 1348.0 | 0.183 |
| 1347.0 | 0.192 |
| 1346.0 | 0.202 |
| 1345.0 | 0.213 |
| 1344.0 | 0.222 |
| 1343.0 | 0.23 |
| 1342.0 | 0.236 |
| 1341.0 | 0.241 |
| 1340.0 | 0.243 |
| 1339.0 | 0.243 |
| 1338.0 | 0.24 |
| 1337.0 | 0.234 |
| 1336.0 | 0.227 |
| 1335.0 | 0.218 |
| 1334.0 | 0.208 |
| 1333.0 | 0.198 |
| 1332.0 | 0.19 |
| 1331.0 | 0.182 |
| 1330.0 | 0.178 |
| 1329.0 | 0.177 |
| 1328.0 | 0.179 |
| 1327.0 | 0.185 |
| 1326.0 | 0.193 |
| 1325.0 | 0.204 |
| 1324.0 | 0.216 |
| 1323.0 | 0.229 |
| 1322.0 | 0.241 |
| 1321.0 | 0.252 |
| 1320.0 | 0.261 |
| 1319.0 | 0.267 |
| 1318.0 | 0.27 |
| 1317.0 | 0.27 |
| 1316.0 | 0.266 |
| 1315.0 | 0.26 |
| 1314.0 | 0.251 |
| 1313.0 | 0.24 |
| 1312.0 | 0.229 |
| 1311.0 | 0.218 |
| 1310.0 | 0.207 |
| 1309.0 | 0.198 |
| 1308.0 | 0.192 |
| 1307.0 | 0.188 |
| 1306.0 | 0.188 |
| 1305.0 | 0.189 |
| 1304.0 | 0.193 |
| 1303.0 | 0.198 |
| 1302.0 | 0.203 |
| 1301.0 | 0.208 |
| 1300.0 | 0.212 |
| 1299.0 | 0.214 |
| 1298.0 | 0.215 |
| 1297.0 | 0.215 |
| 1296.0 | 0.212 |
| 1295.0 | 0.209 |
| 1294.0 | 0.204 |
| 1293.0 | 0.199 |
| 1292.0 | 0.194 |
| 1291.0 | 0.19 |
| 1290.0 | 0.188 |
| 1289.0 | 0.187 |
| 1288.0 | 0.187 |
| 1287.0 | 0.19 |
| 1286.0 | 0.193 |
| 1285.0 | 0.198 |
| 1284.0 | 0.203 |
| 1283.0 | 0.207 |
| 1282.0 | 0.211 |
| 1281.0 | 0.213 |
| 1280.0 | 0.214 |
| 1279.0 | 0.212 |
| 1278.0 | 0.209 |
| 1277.0 | 0.205 |
| 1276.0 | 0.201 |
| 1275.0 | 0.196 |
| 1274.0 | 0.193 |
| 1273.0 | 0.191 |
| 1272.0 | 0.192 |
| 1271.0 | 0.195 |
| 1270.0 | 0.201 |
| 1269.0 | 0.209 |
| 1268.0 | 0.218 |
| 1267.0 | 0.228 |
| 1266.0 | 0.238 |
| 1265.0 | 0.247 |
| 1264.0 | 0.254 |
| 1263.0 | 0.258 |
| 1262.0 | 0.259 |
| 1261.0 | 0.258 |
| 1260.0 | 0.253 |
| 1259.0 | 0.246 |
| 1258.0 | 0.238 |
| 1257.0 | 0.228 |
| 1256.0 | 0.219 |
| 1255.0 | 0.21 |
| 1254.0 | 0.203 |
| 1253.0 | 0.199 |
| 1252.0 | 0.199 |
| 1251.0 | 0.201 |
| 1250.0 | 0.207 |
| 1249.0 | 0.215 |
| 1248.0 | 0.225 |
| 1247.0 | 0.235 |
| 1246.0 | 0.245 |
| 1245.0 | 0.253 |
| 1244.0 | 0.26 |
| 1243.0 | 0.263 |
| 1242.0 | 0.263 |
| 1241.0 | 0.26 |
| 1240.0 | 0.255 |
| 1239.0 | 0.248 |
| 1238.0 | 0.239 |
| 1237.0 | 0.229 |
| 1236.0 | 0.22 |
| 1235.0 | 0.212 |
| 1234.0 | 0.206 |
| 1233.0 | 0.202 |
| 1232.0 | 0.201 |
| 1231.0 | 0.202 |
| 1230.0 | 0.204 |
| 1229.0 | 0.207 |
| 1228.0 | 0.211 |
| 1227.0 | 0.214 |
| 1226.0 | 0.216 |
| 1225.0 | 0.218 |
| 1224.0 | 0.218 |
| 1223.0 | 0.217 |
| 1222.0 | 0.215 |
| 1221.0 | 0.213 |
| 1220.0 | 0.211 |
| 1219.0 | 0.208 |
| 1218.0 | 0.207 |
| 1217.0 | 0.205 |
| 1216.0 | 0.205 |
| 1215.0 | 0.205 |
| 1214.0 | 0.205 |
| 1213.0 | 0.205 |
| 1212.0 | 0.206 |
| 1211.0 | 0.205 |
| 1210.0 | 0.205 |
| 1209.0 | 0.204 |
| 1208.0 | 0.203 |
| 1207.0 | 0.202 |
| 1206.0 | 0.202 |
| 1205.0 | 0.202 |
| 1204.0 | 0.203 |
| 1203.0 | 0.206 |
| 1202.0 | 0.21 |
| 1201.0 | 0.215 |
| 1200.0 | 0.222 |
| 1199.0 | 0.228 |
| 1198.0 | 0.235 |
| 1197.0 | 0.24 |
| 1196.0 | 0.244 |
| 1195.0 | 0.246 |
| 1194.0 | 0.247 |
| 1193.0 | 0.246 |
| 1192.0 | 0.244 |
| 1191.0 | 0.241 |
| 1190.0 | 0.237 |
| 1189.0 | 0.234 |
| 1188.0 | 0.231 |
| 1187.0 | 0.23 |
| 1186.0 | 0.23 |
| 1185.0 | 0.231 |
| 1184.0 | 0.233 |
| 1183.0 | 0.235 |
| 1182.0 | 0.238 |
| 1181.0 | 0.24 |
| 1180.0 | 0.241 |
| 1179.0 | 0.241 |
| 1178.0 | 0.241 |
| 1177.0 | 0.24 |
| 1176.0 | 0.239 |
| 1175.0 | 0.238 |
| 1174.0 | 0.238 |
| 1173.0 | 0.24 |
| 1172.0 | 0.242 |
| 1171.0 | 0.246 |
| 1170.0 | 0.251 |
| 1169.0 | 0.256 |
| 1168.0 | 0.261 |
| 1167.0 | 0.265 |
| 1166.0 | 0.268 |
| 1165.0 | 0.269 |
| 1164.0 | 0.267 |
| 1163.0 | 0.263 |
| 1162.0 | 0.257 |
| 1161.0 | 0.249 |
| 1160.0 | 0.24 |
| 1159.0 | 0.231 |
| 1158.0 | 0.224 |
| 1157.0 | 0.219 |
| 1156.0 | 0.216 |
| 1155.0 | 0.215 |
| 1154.0 | 0.216 |
| 1153.0 | 0.218 |
| 1152.0 | 0.221 |
| 1151.0 | 0.224 |
| 1150.0 | 0.225 |
| 1149.0 | 0.224 |
| 1148.0 | 0.222 |
| 1147.0 | 0.219 |
| 1146.0 | 0.215 |
| 1145.0 | 0.211 |
| 1144.0 | 0.208 |
| 1143.0 | 0.206 |
| 1142.0 | 0.206 |
| 1141.0 | 0.208 |
| 1140.0 | 0.212 |
| 1139.0 | 0.215 |
| 1138.0 | 0.219 |
| 1137.0 | 0.222 |
| 1136.0 | 0.223 |
| 1135.0 | 0.222 |
| 1134.0 | 0.219 |
| 1133.0 | 0.216 |
| 1132.0 | 0.212 |
| 1131.0 | 0.208 |
| 1130.0 | 0.206 |
| 1129.0 | 0.207 |
| 1128.0 | 0.211 |
| 1127.0 | 0.218 |
| 1126.0 | 0.227 |
| 1125.0 | 0.239 |
| 1124.0 | 0.25 |
| 1123.0 | 0.259 |
| 1122.0 | 0.266 |
| 1121.0 | 0.269 |
| 1120.0 | 0.267 |
| 1119.0 | 0.261 |
| 1118.0 | 0.252 |
| 1117.0 | 0.241 |
| 1116.0 | 0.23 |
| 1115.0 | 0.222 |
| 1114.0 | 0.217 |
| 1113.0 | 0.217 |
| 1112.0 | 0.221 |
| 1111.0 | 0.23 |
| 1110.0 | 0.24 |
| 1109.0 | 0.249 |
| 1108.0 | 0.257 |
| 1107.0 | 0.262 |
| 1106.0 | 0.262 |
| 1105.0 | 0.259 |
| 1104.0 | 0.252 |
| 1103.0 | 0.244 |
| 1102.0 | 0.235 |
| 1101.0 | 0.229 |
| 1100.0 | 0.227 |
| 1099.0 | 0.229 |
| 1098.0 | 0.235 |
| 1097.0 | 0.245 |
| 1096.0 | 0.256 |
| 1095.0 | 0.266 |
| 1094.0 | 0.275 |
| 1093.0 | 0.281 |
| 1092.0 | 0.282 |
| 1091.0 | 0.279 |
| 1090.0 | 0.27 |
| 1089.0 | 0.259 |
| 1088.0 | 0.245 |
| 1087.0 | 0.232 |
| 1086.0 | 0.219 |
| 1085.0 | 0.211 |
| 1084.0 | 0.206 |
| 1083.0 | 0.205 |
| 1082.0 | 0.208 |
| 1081.0 | 0.212 |
| 1080.0 | 0.217 |
| 1079.0 | 0.221 |
| 1078.0 | 0.222 |
| 1077.0 | 0.222 |
| 1076.0 | 0.219 |
| 1075.0 | 0.215 |
| 1074.0 | 0.211 |
| 1073.0 | 0.207 |
| 1072.0 | 0.203 |
| 1071.0 | 0.2 |
| 1070.0 | 0.198 |
| 1069.0 | 0.196 |
| 1068.0 | 0.194 |
| 1067.0 | 0.192 |
| 1066.0 | 0.19 |
| 1065.0 | 0.189 |
| 1064.0 | 0.189 |
| 1063.0 | 0.191 |
| 1062.0 | 0.195 |
| 1061.0 | 0.201 |
| 1060.0 | 0.208 |
| 1059.0 | 0.215 |
| 1058.0 | 0.22 |
| 1057.0 | 0.223 |
| 1056.0 | 0.223 |
| 1055.0 | 0.221 |
| 1054.0 | 0.216 |
| 1053.0 | 0.212 |
| 1052.0 | 0.209 |
| 1051.0 | 0.209 |
| 1050.0 | 0.215 |
| 1049.0 | 0.226 |
| 1048.0 | 0.24 |
| 1047.0 | 0.256 |
| 1046.0 | 0.27 |
| 1045.0 | 0.281 |
| 1044.0 | 0.285 |
| 1043.0 | 0.283 |
| 1042.0 | 0.273 |
| 1041.0 | 0.26 |
| 1040.0 | 0.246 |
| 1039.0 | 0.238 |
| 1038.0 | 0.238 |
| 1037.0 | 0.251 |
| 1036.0 | 0.273 |
| 1035.0 | 0.302 |
| 1034.0 | 0.335 |
| 1033.0 | 0.362 |
| 1032.0 | 0.382 |
| 1031.0 | 0.389 |
| 1030.0 | 0.384 |
| 1029.0 | 0.364 |
| 1028.0 | 0.335 |
| 1027.0 | 0.301 |
| 1026.0 | 0.267 |
| 1025.0 | 0.243 |
| 1024.0 | 0.235 |
| 1023.0 | 0.241 |
| 1022.0 | 0.261 |
| 1021.0 | 0.288 |
| 1020.0 | 0.317 |
| 1019.0 | 0.34 |
| 1018.0 | 0.35 |
| 1017.0 | 0.349 |
| 1016.0 | 0.335 |
| 1015.0 | 0.311 |
| 1014.0 | 0.28 |
| 1013.0 | 0.249 |
| 1012.0 | 0.226 |
| 1011.0 | 0.213 |
| 1010.0 | 0.212 |
| 1009.0 | 0.221 |
| 1008.0 | 0.239 |
| 1007.0 | 0.255 |
| 1006.0 | 0.268 |
| 1005.0 | 0.273 |
| 1004.0 | 0.268 |
| 1003.0 | 0.253 |
| 1002.0 | 0.233 |
| 1001.0 | 0.211 |
| 1000.0 | 0.192 |
| 999.0 | 0.18 |
| 998.0 | 0.178 |
| 997.0 | 0.183 |
| 996.0 | 0.193 |
| 995.0 | 0.203 |
| 994.0 | 0.21 |
| 993.0 | 0.212 |
| 992.0 | 0.208 |
| 991.0 | 0.2 |
| 990.0 | 0.189 |
| 989.0 | 0.179 |
| 988.0 | 0.171 |
| 987.0 | 0.167 |
| 986.0 | 0.166 |
| 985.0 | 0.168 |
| 984.0 | 0.171 |
| 983.0 | 0.176 |
| 982.0 | 0.181 |
| 981.0 | 0.188 |
| 980.0 | 0.195 |
| 979.0 | 0.202 |
| 978.0 | 0.21 |
| 977.0 | 0.216 |
| 976.0 | 0.219 |
| 975.0 | 0.218 |
| 974.0 | 0.213 |
| 973.0 | 0.205 |
| 972.0 | 0.195 |
| 971.0 | 0.186 |
| 970.0 | 0.182 |
| 969.0 | 0.184 |
| 968.0 | 0.192 |
| 967.0 | 0.205 |
| 966.0 | 0.221 |
| 965.0 | 0.232 |
| 964.0 | 0.239 |
| 963.0 | 0.237 |
| 962.0 | 0.226 |
| 961.0 | 0.209 |
| 960.0 | 0.187 |
| 959.0 | 0.168 |
| 958.0 | 0.155 |
| 957.0 | 0.147 |
| 956.0 | 0.147 |
| 955.0 | 0.15 |
| 954.0 | 0.154 |
| 953.0 | 0.154 |
| 952.0 | 0.15 |
| 951.0 | 0.143 |
| 950.0 | 0.134 |
| 949.0 | 0.126 |
| 948.0 | 0.123 |
| 947.0 | 0.124 |
| 946.0 | 0.127 |
| 945.0 | 0.132 |
| 944.0 | 0.134 |
| 943.0 | 0.133 |
| 942.0 | 0.128 |
| 941.0 | 0.122 |
| 940.0 | 0.116 |
| 939.0 | 0.115 |
| 938.0 | 0.12 |
| 937.0 | 0.13 |
| 936.0 | 0.141 |
| 935.0 | 0.151 |
| 934.0 | 0.156 |
| 933.0 | 0.155 |
| 932.0 | 0.149 |
| 931.0 | 0.139 |
| 930.0 | 0.131 |
| 929.0 | 0.127 |
| 928.0 | 0.13 |
| 927.0 | 0.139 |
| 926.0 | 0.153 |
| 925.0 | 0.166 |
| 924.0 | 0.175 |
| 923.0 | 0.177 |
| 922.0 | 0.171 |
| 921.0 | 0.16 |
| 920.0 | 0.147 |
| 919.0 | 0.135 |
| 918.0 | 0.128 |
| 917.0 | 0.126 |
| 916.0 | 0.125 |
| 915.0 | 0.124 |
| 914.0 | 0.121 |
| 913.0 | 0.115 |
| 912.0 | 0.107 |
| 911.0 | 0.099 |
| 910.0 | 0.094 |
| 909.0 | 0.093 |
| 908.0 | 0.094 |
| 907.0 | 0.097 |
| 906.0 | 0.098 |
| 905.0 | 0.098 |
| 904.0 | 0.094 |
| 903.0 | 0.09 |
| 902.0 | 0.086 |
| 901.0 | 0.083 |
| 900.0 | 0.082 |
| 899.0 | 0.082 |
| 898.0 | 0.083 |
| 897.0 | 0.083 |
| 896.0 | 0.082 |
| 895.0 | 0.081 |
| 894.0 | 0.081 |
| 893.0 | 0.082 |
| 892.0 | 0.085 |
| 891.0 | 0.09 |
| 890.0 | 0.095 |
| 889.0 | 0.1 |
| 888.0 | 0.105 |
| 887.0 | 0.11 |
| 886.0 | 0.116 |
| 885.0 | 0.124 |
| 884.0 | 0.132 |
| 883.0 | 0.141 |
| 882.0 | 0.147 |
| 881.0 | 0.149 |
| 880.0 | 0.149 |
| 879.0 | 0.147 |
| 878.0 | 0.147 |
| 877.0 | 0.15 |
| 876.0 | 0.159 |
| 875.0 | 0.172 |
| 874.0 | 0.185 |
| 873.0 | 0.194 |
| 872.0 | 0.195 |
| 871.0 | 0.188 |
| 870.0 | 0.176 |
| 869.0 | 0.164 |
| 868.0 | 0.156 |
| 867.0 | 0.154 |
| 866.0 | 0.157 |
| 865.0 | 0.165 |
| 864.0 | 0.172 |
| 863.0 | 0.174 |
| 862.0 | 0.169 |
| 861.0 | 0.159 |
| 860.0 | 0.138 |
| 859.0 | 0.101 |
| 858.0 | 0.066 |
| 857.0 | 0.054 |
| 856.0 | 0.062 |
| 855.0 | 0.076 |
| 854.0 | 0.083 |
| 853.0 | 0.078 |
| 852.0 | 0.066 |
| 851.0 | 0.058 |
| 850.0 | 0.061 |
| 849.0 | 0.077 |
| 848.0 | 0.099 |
| 847.0 | 0.115 |
| 846.0 | 0.115 |
| 845.0 | 0.1 |
| 844.0 | 0.081 |
| 843.0 | 0.071 |
| 842.0 | 0.082 |
| 841.0 | 0.114 |
| 840.0 | 0.159 |
| 839.0 | 0.202 |
| 838.0 | 0.231 |
| 837.0 | 0.24 |
| 836.0 | 0.231 |
| 835.0 | 0.211 |
| 834.0 | 0.189 |
| 833.0 | 0.171 |
| 832.0 | 0.161 |
| 831.0 | 0.158 |
| 830.0 | 0.16 |
| 829.0 | 0.165 |
| 828.0 | 0.169 |
| 827.0 | 0.172 |
| 826.0 | 0.169 |
| 825.0 | 0.156 |
| 824.0 | 0.134 |
| 823.0 | 0.105 |
| 822.0 | 0.077 |
| 821.0 | 0.058 |
| 820.0 | 0.051 |
| 819.0 | 0.054 |
| 818.0 | 0.058 |
| 817.0 | 0.054 |
| 816.0 | 0.041 |
| 815.0 | 0.03 |
| 814.0 | 0.033 |
| 813.0 | 0.056 |
| 812.0 | 0.094 |
| 811.0 | 0.134 |
| 810.0 | 0.159 |
| 809.0 | 0.163 |
| 808.0 | 0.153 |
| 807.0 | 0.146 |
| 806.0 | 0.156 |
| 805.0 | 0.186 |
| 804.0 | 0.219 |
| 803.0 | 0.239 |
| 802.0 | 0.234 |
| 801.0 | 0.212 |
| 800.0 | 0.195 |
| 799.0 | 0.209 |
| 798.0 | 0.26 |
| 797.0 | 0.333 |
| 796.0 | 0.394 |
| 795.0 | 0.416 |
| 794.0 | 0.387 |
| 793.0 | 0.319 |
| 792.0 | 0.245 |
| 791.0 | 0.207 |
| 790.0 | 0.224 |
| 789.0 | 0.287 |
| 788.0 | 0.355 |
| 787.0 | 0.392 |
| 786.0 | 0.377 |
| 785.0 | 0.316 |
| 784.0 | 0.236 |
| 783.0 | 0.168 |
| 782.0 | 0.135 |
| 781.0 | 0.138 |
| 780.0 | 0.16 |
| 779.0 | 0.179 |
| 778.0 | 0.179 |
| 777.0 | 0.158 |
| 776.0 | 0.122 |
| 775.0 | 0.082 |
| 774.0 | 0.05 |
| 773.0 | 0.036 |
| 772.0 | 0.041 |
| 771.0 | 0.06 |
| 770.0 | 0.079 |
| 769.0 | 0.085 |
| 768.0 | 0.07 |
| 767.0 | 0.046 |
| 766.0 | 0.04 |
| 765.0 | 0.066 |
| 764.0 | 0.116 |
| 763.0 | 0.165 |
| 762.0 | 0.185 |
| 761.0 | 0.168 |
| 760.0 | 0.132 |
| 759.0 | 0.11 |
| 758.0 | 0.128 |
| 757.0 | 0.179 |
| 756.0 | 0.227 |
| 755.0 | 0.237 |
| 754.0 | 0.201 |
| 753.0 | 0.139 |
| 752.0 | 0.091 |
| 751.0 | 0.079 |
| 750.0 | 0.099 |
| 749.0 | 0.119 |
| 748.0 | 0.11 |
| 747.0 | 0.072 |
| 746.0 | 0.039 |
| 745.0 | 0.039 |
| 744.0 | 0.066 |
| 743.0 | 0.091 |
| 742.0 | 0.089 |
| 741.0 | 0.062 |
| 740.0 | 0.04 |
| 739.0 | 0.054 |
| 738.0 | 0.102 |
| 737.0 | 0.152 |
| 736.0 | 0.172 |
| 735.0 | 0.154 |
| 734.0 | 0.127 |
| 733.0 | 0.122 |
| 732.0 | 0.149 |
| 731.0 | 0.195 |
| 730.0 | 0.235 |
| 729.0 | 0.253 |
| 728.0 | 0.248 |
| 727.0 | 0.231 |
| 726.0 | 0.211 |
| 725.0 | 0.197 |
| 724.0 | 0.195 |
| 723.0 | 0.206 |
| 722.0 | 0.227 |
| 721.0 | 0.239 |
| 720.0 | 0.222 |
| 719.0 | 0.168 |
| 718.0 | 0.104 |
| 717.0 | 0.076 |
| 716.0 | 0.101 |
| 715.0 | 0.15 |
| 714.0 | 0.17 |
| 713.0 | 0.135 |
| 712.0 | 0.074 |
| 711.0 | 0.04 |
| 710.0 | 0.058 |
| 709.0 | 0.104 |
| 708.0 | 0.12 |
| 707.0 | 0.089 |
| 706.0 | 0.065 |
| 705.0 | 0.101 |
| 704.0 | 0.191 |
| 703.0 | 0.28 |
| 702.0 | 0.313 |
| 701.0 | 0.29 |
| 700.0 | 0.26 |
| 699.0 | 0.27 |
| 698.0 | 0.323 |
| 697.0 | 0.378 |
| 696.0 | 0.39 |
| 695.0 | 0.361 |
| 694.0 | 0.33 |
| 693.0 | 0.326 |
| 692.0 | 0.348 |
| 691.0 | 0.367 |
| 690.0 | 0.361 |
| 689.0 | 0.334 |
| 688.0 | 0.313 |
| 687.0 | 0.305 |
| 686.0 | 0.303 |
| 685.0 | 0.289 |
| 684.0 | 0.262 |
| 683.0 | 0.236 |
| 682.0 | 0.219 |
| 681.0 | 0.204 |
| 680.0 | 0.179 |
| 679.0 | 0.143 |
| 678.0 | 0.108 |
| 677.0 | 0.085 |
| 676.0 | 0.073 |
| 675.0 | 0.062 |
| 674.0 | 0.046 |
| 673.0 | 0.028 |
| 672.0 | 0.016 |
| 671.0 | 0.018 |
| 670.0 | 0.042 |
| 669.0 | 0.078 |
| 668.0 | 0.104 |
| 667.0 | 0.097 |
| 666.0 | 0.061 |
| 665.0 | 0.029 |
| 664.0 | 0.031 |
| 663.0 | 0.06 |
| 662.0 | 0.08 |
| 661.0 | 0.067 |
| 660.0 | 0.034 |
| 659.0 | 0.02 |
| 658.0 | 0.035 |
| 657.0 | 0.055 |
| 656.0 | 0.051 |
| 655.0 | 0.029 |
| 654.0 | 0.015 |
| 653.0 | 0.021 |
| 652.0 | 0.033 |
| 651.0 | 0.033 |
| 650.0 | 0.024 |
| 649.0 | 0.021 |
| 648.0 | 0.034 |
| 647.0 | 0.053 |
| 646.0 | 0.06 |
| 645.0 | 0.049 |
| 644.0 | 0.032 |
| 643.0 | 0.029 |
| 642.0 | 0.045 |
| 641.0 | 0.064 |
| 640.0 | 0.063 |
| 639.0 | 0.039 |
| 638.0 | 0.021 |
| 637.0 | 0.029 |
| 636.0 | 0.049 |
| 635.0 | 0.051 |
| 634.0 | 0.032 |
| 633.0 | 0.018 |
| 632.0 | 0.023 |
| 631.0 | 0.03 |
| 630.0 | 0.023 |
| 629.0 | 0.02 |
| 628.0 | 0.042 |
| 627.0 | 0.071 |
| 626.0 | 0.07 |
| 625.0 | 0.042 |
| 624.0 | 0.033 |
| 623.0 | 0.061 |
| 622.0 | 0.093 |
| 621.0 | 0.086 |
| 620.0 | 0.051 |
| 619.0 | 0.037 |
| 618.0 | 0.055 |
| 617.0 | 0.074 |
| 616.0 | 0.062 |
| 615.0 | 0.032 |
| 614.0 | 0.017 |
| 613.0 | 0.018 |
| 612.0 | 0.02 |
| 611.0 | 0.015 |
| 610.0 | 0.011 |
| 609.0 | 0.017 |
| 608.0 | 0.031 |
| 607.0 | 0.041 |
| 606.0 | 0.035 |
| 605.0 | 0.02 |
| 604.0 | 0.013 |
| 603.0 | 0.018 |
| 602.0 | 0.024 |
| 601.0 | 0.02 |
| 600.0 | 0.011 |
| 599.0 | 0.01 |
| 598.0 | 0.014 |
| 597.0 | 0.013 |
| 596.0 | 0.008 |
| 595.0 | 0.005 |
| 594.0 | 0.006 |
| 593.0 | 0.006 |
| 592.0 | 0.004 |
| 591.0 | 0.003 |
| 590.0 | 0.002 |
| 589.0 | 0.003 |
| 588.0 | 0.002 |
| 587.0 | 0.002 |
| 586.0 | 0.003 |
| 585.0 | 0.002 |
| 584.0 | 0.002 |
| 583.0 | 0.003 |
| 582.0 | 0.002 |
| 581.0 | 0.002 |
| 580.0 | 0.002 |
| 579.0 | 0.002 |
| 578.0 | 0.002 |
| 577.0 | 0.003 |
| 576.0 | 0.002 |
| 575.0 | 0.002 |
| 574.0 | 0.002 |
| 573.0 | 0.002 |
| 572.0 | 0.002 |
| 571.0 | 0.002 |
| 570.0 | 0.01 |
| 569.0 | 0.01 |
| 568.0 | 0.009 |
| 567.0 | 0.009 |
| 566.0 | 0.006 |
| 565.0 | 0.012 |
| 564.0 | 0.01 |
| 563.0 | 0.004 |
| 562.0 | 0.011 |
| 561.0 | 0.01 |
| 560.0 | 0.01 |
| 559.0 | 0.01 |
| 558.0 | 0.008 |
| 557.0 | 0.009 |
| 556.0 | 0.01 |
| 555.0 | 0.011 |
| 554.0 | 0.008 |
| 553.0 | 0.01 |
| 552.0 | 0.008 |
| 551.0 | 0.008 |
| 550.0 | 0.008 |
| 549.0 | 0.007 |
| 548.0 | 0.009 |
| 547.0 | 0.007 |
| 546.0 | 0.004 |
| 545.0 | 0.006 |
| 544.0 | 0.007 |
| 543.0 | 0.01 |
| 542.0 | 0.004 |
| 541.0 | 0.011 |
| 540.0 | 0.01 |
| 539.0 | 0.01 |
| 538.0 | 0.01 |
| 537.0 | 0.008 |
| 536.0 | 0.009 |
| 535.0 | 0.01 |
| 534.0 | 0.011 |
| 533.0 | 0.009 |
| 532.0 | 0.01 |
| 531.0 | 0.008 |
| 530.0 | 0.01 |
| 529.0 | 0.01 |
| 528.0 | 0.009 |
| 527.0 | 0.011 |
| 526.0 | 0.007 |
| 525.0 | 0.006 |
| 524.0 | 0.006 |
| 523.0 | 0.007 |
| 522.0 | 0.007 |
| 521.0 | 0.004 |
| 520.0 | 0.006 |
| 519.0 | 0.007 |
| 518.0 | 0.01 |
| 517.0 | 0.01 |
| 516.0 | 0.009 |
| 515.0 | 0.009 |
| 514.0 | 0.006 |
| 513.0 | 0.011 |
| 512.0 | 0.01 |
| 511.0 | 0.004 |
| 510.0 | 0.011 |
| 509.0 | 0.005 |
| 508.0 | 0.005 |
| 507.0 | 0.009 |
| 506.0 | 0.008 |
| 505.0 | 0.009 |
| 504.0 | 0.01 |
| 503.0 | 0.011 |
| 502.0 | 0.008 |
| 501.0 | 0.01 |
| 500.0 | 0.008 |
| 499.0 | 0.01 |
| 498.0 | 0.01 |
| 497.0 | 0.009 |
| 496.0 | 0.011 |
| 495.0 | 0.011 |
| 494.0 | 0.01 |
| 493.0 | 0.01 |
| 492.0 | 0.011 |
| 491.0 | 0.01 |
| 490.0 | 0.008 |
| 489.0 | 0.011 |
| 488.0 | 0.009 |
| 487.0 | 0.009 |
| 486.0 | 0.009 |
| 485.0 | 0.012 |
| 484.0 | 0.009 |
| 483.0 | 0.01 |
| 482.0 | 0.011 |
| 481.0 | 0.008 |
| 480.0 | 0.01 |
| 479.0 | 0.008 |
| 478.0 | 0.01 |
| 477.0 | 0.01 |
| 476.0 | 0.009 |
| 475.0 | 0.011 |
| 474.0 | 0.007 |
| 473.0 | 0.006 |
| 472.0 | 0.006 |
| 471.0 | 0.007 |
| 470.0 | 0.007 |
| 469.0 | 0.004 |
| 468.0 | 0.006 |
| 467.0 | 0.007 |
| 466.0 | 0.008 |
| 465.0 | 0.009 |
| 464.0 | 0.01 |
| 463.0 | 0.011 |
| 462.0 | 0.008 |
| 461.0 | 0.01 |
| 460.0 | 0.008 |
| 459.0 | 0.01 |
| 458.0 | 0.01 |
| 457.0 | 0.009 |
| 456.0 | 0.011 |
| 455.0 | 0.009 |
| 454.0 | 0.01 |
| 453.0 | 0.012 |
| 452.0 | 0.009 |
| 451.0 | 0.009 |
| 450.0 | 0.005 |
| 449.0 | 0.007 |
| 448.0 | 0.009 |
| 447.0 | 0.009 |
| 446.0 | 0.01 |
| 445.0 | 0.009 |
| 444.0 | 0.01 |
| 443.0 | 0.011 |
| 442.0 | 0.008 |
| 441.0 | 0.01 |
| 440.0 | 0.008 |
| 439.0 | 0.007 |
| 438.0 | 0.008 |
| 437.0 | 0.007 |
| 436.0 | 0.008 |
| 435.0 | 0.007 |
| 434.0 | 0.004 |
| 433.0 | 0.006 |
| 432.0 | 0.007 |
| 431.0 | 0.007 |
| 430.0 | 0.004 |
| 429.0 | 0.006 |
| 428.0 | 0.007 |
| 427.0 | 0.008 |
| 426.0 | 0.007 |
| 425.0 | 0.008 |
| 424.0 | 0.009 |
| 423.0 | 0.01 |
| 422.0 | 0.01 |
| 421.0 | 0.01 |
| 420.0 | 0.009 |
| 419.0 | 0.011 |
| 418.0 | 0.007 |
| 417.0 | 0.007 |
| 416.0 | 0.007 |
| 415.0 | 0.002 |
| 414.0 | 0.009 |
| 413.0 | 0.007 |
| 412.0 | 0.008 |
| 411.0 | 0.046 |
| 410.0 | 0.753 |
| 409.0 | 2.618 |
| 408.0 | 3.74 |
| 407.0 | 5.031 |
| 406.0 | 5.462 |
| 405.0 | 6.017 |
| 404.0 | 5.421 |
| 403.0 | 6.569 |
| 402.0 | 5.291 |
| 401.0 | 3.595 |
| 400.0 | 2.747 |
| 399.0 | 0.648 |
| 398.0 | 0.039 |
| 397.0 | 0.009 |
| 396.0 | 0.007 |
| 395.0 | 0.008 |
| 394.0 | 0.007 |
| 393.0 | 0.01 |
| 392.0 | 0.009 |
| 391.0 | 0.011 |
| 390.0 | 0.009 |
| 389.0 | 0.011 |
| 388.0 | 0.01 |
| 387.0 | 0.01 |
| 386.0 | 0.01 |
| 385.0 | 0.01 |
| 384.0 | 0.009 |
| 383.0 | 0.009 |
| 382.0 | 0.006 |
| 381.0 | 0.012 |
| 380.0 | 0.01 |
| 379.0 | 0.004 |
| 378.0 | 0.011 |
| 377.0 | 0.01 |
| 376.0 | 0.01 |
| 375.0 | 0.01 |
| 374.0 | 0.008 |
| 373.0 | 0.009 |
| 372.0 | 0.01 |
| 371.0 | 0.011 |
| 370.0 | 0.009 |
| 369.0 | 0.01 |
| 368.0 | 0.008 |
| 367.0 | 0.01 |
| 366.0 | 0.01 |
| 365.0 | 0.009 |
| 364.0 | 0.011 |
| 363.0 | 0.007 |
| 362.0 | 0.004 |
| 361.0 | 0.006 |
| 360.0 | 0.007 |
| 359.0 | 0.01 |
| 358.0 | 0.01 |
| 357.0 | 0.011 |
| 356.0 | 0.016 |
| 355.0 | 0.023 |
| 354.0 | 0.037 |
| 353.0 | 0.058 |
| 352.0 | 0.088 |
| 351.0 | 0.125 |
| 350.0 | 0.164 |
| 349.0 | 0.182 |
| 348.0 | 0.168 |
| 347.0 | 0.144 |
| 346.0 | 0.135 |
| 345.0 | 0.139 |
| 344.0 | 0.14 |
| 343.0 | 0.14 |
| 342.0 | 0.153 |
| 341.0 | 0.176 |
| 340.0 | 0.2 |
| 339.0 | 0.226 |
| 338.0 | 0.266 |
| 337.0 | 0.31 |
| 336.0 | 0.337 |
| 335.0 | 0.351 |
| 334.0 | 0.375 |
| 333.0 | 0.423 |
| 332.0 | 0.481 |
| 331.0 | 0.519 |
| 330.0 | 0.54 |
| 329.0 | 0.562 |
| 328.0 | 0.597 |
| 327.0 | 0.646 |
| 326.0 | 0.701 |
| 325.0 | 0.749 |
| 324.0 | 0.782 |
| 323.0 | 0.813 |
| 322.0 | 0.849 |
| 321.0 | 0.867 |
| 320.0 | 0.831 |
| 319.0 | 0.771 |
| 318.0 | 0.745 |
| 317.0 | 0.764 |
| 316.0 | 0.807 |
| 315.0 | 0.848 |
| 314.0 | 0.876 |
| 313.0 | 0.925 |
| 312.0 | 0.998 |
| 311.0 | 1.049 |
| 310.0 | 1.104 |
| 309.0 | 1.258 |
| 308.0 | 1.54 |
| 307.0 | 1.877 |
| 306.0 | 2.182 |
| 305.0 | 2.564 |
| 304.0 | 3.235 |
| 303.0 | 4.223 |
| 302.0 | 4.524 |
| 301.0 | 4.524 |
| 300.0 | 4.775 |
| 299.0 | 4.43 |
| 298.0 | 4.15 |
| 297.0 | 5.921 |
| 296.0 | 4.401 |
| 295.0 | 5.318 |
| 294.0 | 5.016 |
| 293.0 | 4.388 |
| 292.0 | 4.317 |
| 291.0 | 4.576 |
| 290.0 | 4.387 |
| 289.0 | 5.618 |
| 288.0 | 4.556 |
| 287.0 | 4.374 |
| 286.0 | 4.132 |
| 285.0 | 5.218 |
| 284.0 | 4.337 |
| 283.0 | 5.917 |
| 282.0 | 4.962 |
| 281.0 | 4.348 |
| 280.0 | 4.16 |
| 279.0 | 4.769 |
| 278.0 | 4.183 |
| 277.0 | 5.614 |
| 276.0 | 4.659 |
| 275.0 | 4.383 |
| 274.0 | 4.129 |
| 273.0 | 5.613 |
| 272.0 | 4.346 |
| 271.0 | 5.312 |
| 270.0 | 4.834 |
| 269.0 | 4.301 |
| 268.0 | 4.135 |
| 267.0 | 5.01 |
| 266.0 | 4.767 |
| 265.0 | 4.709 |
| 264.0 | 4.834 |
| 263.0 | 4.269 |
| 262.0 | 4.164 |
| 261.0 | 4.657 |
| 260.0 | 4.259 |
| 259.0 | 4.833 |
| 258.0 | 5.213 |
| 257.0 | 4.204 |
| 256.0 | 4.331 |
| 255.0 | 4.277 |
| 254.0 | 4.266 |
| 253.0 | 4.763 |
| 252.0 | 4.795 |
| 251.0 | 4.246 |
| 250.0 | 4.296 |
| 249.0 | 4.477 |
| 248.0 | 4.245 |
| 247.0 | 4.907 |
| 246.0 | 5.907 |
| 245.0 | 4.217 |
| 244.0 | 4.283 |
| 243.0 | 4.526 |
| 242.0 | 4.316 |
| 241.0 | 4.793 |
| 240.0 | 4.866 |
| 239.0 | 4.244 |
| 238.0 | 4.263 |
| 237.0 | 4.263 |
| 236.0 | 4.327 |
| 235.0 | 4.652 |
| 234.0 | 4.866 |
| 233.0 | 4.208 |
| 232.0 | 4.225 |
| 231.0 | 4.444 |
| 230.0 | 4.253 |
| 229.0 | 4.65 |
| 228.0 | 4.728 |
| 227.0 | 4.18 |
| 226.0 | 4.335 |
| 225.0 | 4.56 |
| 224.0 | 4.248 |
| 223.0 | 4.697 |
| 222.0 | 4.669 |
| 221.0 | 4.227 |
| 220.0 | 4.174 |
| 219.0 | 4.751 |
| 218.0 | 4.243 |
| 217.0 | 4.896 |
| 216.0 | 4.533 |
| 215.0 | 4.303 |
| 214.0 | 4.25 |
| 213.0 | 4.28 |
| 212.0 | 4.22 |
| 211.0 | 4.891 |
| 210.0 | 4.548 |
| 209.0 | 4.199 |
| 208.0 | 4.075 |
| 207.0 | 4.526 |
| 206.0 | 4.154 |
| 205.0 | 4.564 |
| 204.0 | 4.423 |
| 203.0 | 4.129 |
| 202.0 | 4.032 |
| 201.0 | 4.119 |
| 200.0 | 3.974 |